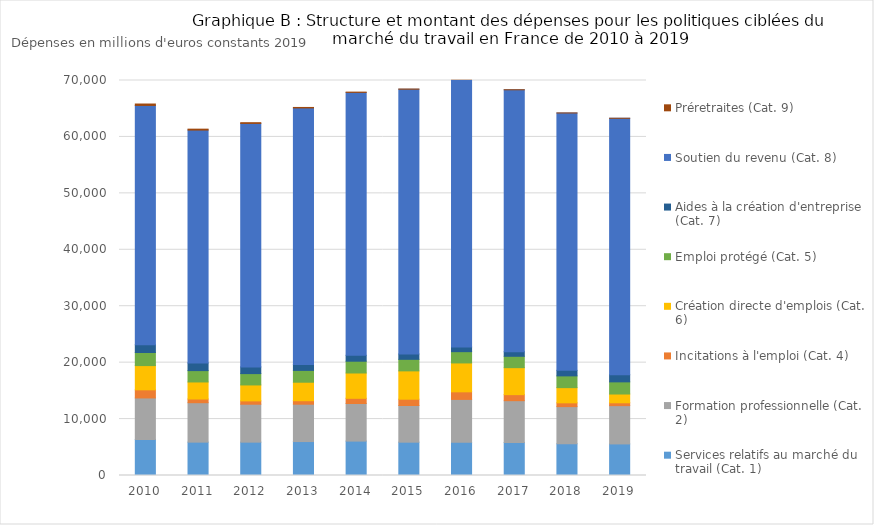
| Category | Services relatifs au marché du travail (Cat. 1) | Formation professionnelle (Cat. 2) | Incitations à l'emploi (Cat. 4) | Création directe d'emplois (Cat. 6) | Emploi protégé (Cat. 5) | Aides à la création d'entreprise (Cat. 7) | Soutien du revenu (Cat. 8) | Préretraites (Cat. 9) |
|---|---|---|---|---|---|---|---|---|
| 0 | 6388.503 | 7353.843 | 1439.78 | 4294.159 | 2324.76 | 1362.086 | 42417.648 | 252.505 |
| 1 | 5912.496 | 6989.43 | 654.713 | 3019.446 | 2013.382 | 1360.246 | 41264.229 | 164.615 |
| 2 | 5908.971 | 6721.752 | 591.903 | 2825.846 | 2008.987 | 1189.574 | 43145.904 | 132.197 |
| 3 | 6016.956 | 6616.994 | 620.625 | 3276.484 | 2093.357 | 1050.767 | 45464.545 | 84.122 |
| 4 | 6097.165 | 6660.39 | 922.29 | 4486.268 | 2086.817 | 1046.948 | 46594.54 | 49.03 |
| 5 | 5906.063 | 6498.638 | 1118.45 | 5018.315 | 2045.722 | 941.682 | 46928.442 | 28.332 |
| 6 | 5894.888 | 7589.934 | 1342.964 | 5119.33 | 1997.845 | 831.329 | 47446.844 | 13.738 |
| 7 | 5858.121 | 7399.77 | 1073.177 | 4781.525 | 2012.65 | 813.405 | 46413.101 | 5.602 |
| 8 | 5626.027 | 6580.75 | 672.002 | 2693.963 | 2080.898 | 976.306 | 45614.949 | 1.903 |
| 9 | 5594.13 | 6786.315 | 506.132 | 1554.019 | 2151.909 | 1259.846 | 45453.201 | 0.854 |